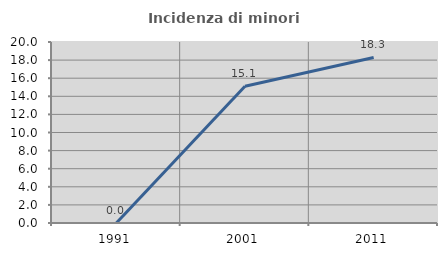
| Category | Incidenza di minori stranieri |
|---|---|
| 1991.0 | 0 |
| 2001.0 | 15.116 |
| 2011.0 | 18.293 |